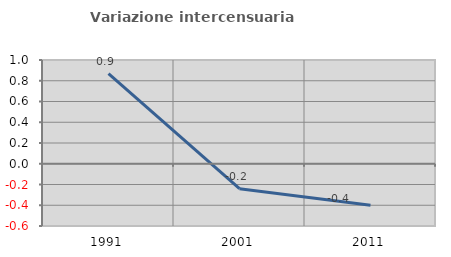
| Category | Variazione intercensuaria annua |
|---|---|
| 1991.0 | 0.869 |
| 2001.0 | -0.241 |
| 2011.0 | -0.4 |